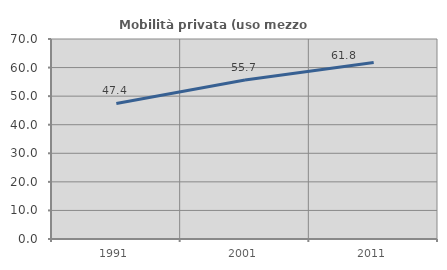
| Category | Mobilità privata (uso mezzo privato) |
|---|---|
| 1991.0 | 47.434 |
| 2001.0 | 55.661 |
| 2011.0 | 61.783 |